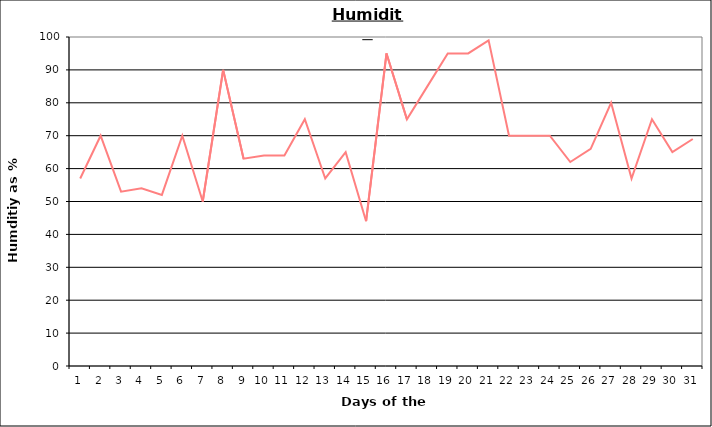
| Category | Series 0 |
|---|---|
| 0 | 57 |
| 1 | 70 |
| 2 | 53 |
| 3 | 54 |
| 4 | 52 |
| 5 | 70 |
| 6 | 50 |
| 7 | 90 |
| 8 | 63 |
| 9 | 64 |
| 10 | 64 |
| 11 | 75 |
| 12 | 57 |
| 13 | 65 |
| 14 | 44 |
| 15 | 95 |
| 16 | 75 |
| 17 | 85 |
| 18 | 95 |
| 19 | 95 |
| 20 | 99 |
| 21 | 70 |
| 22 | 70 |
| 23 | 70 |
| 24 | 62 |
| 25 | 66 |
| 26 | 80 |
| 27 | 57 |
| 28 | 75 |
| 29 | 65 |
| 30 | 69 |